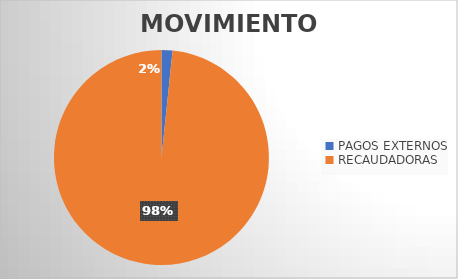
| Category | MOVIMIENTOS |
|---|---|
| PAGOS EXTERNOS | 370 |
| RECAUDADORAS | 22067 |